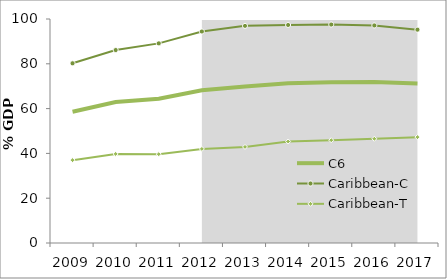
| Category | C6 | Caribbean-C | Caribbean-T |
|---|---|---|---|
| 2009.0 | 58.61 | 80.234 | 36.986 |
| 2010.0 | 62.946 | 86.131 | 39.76 |
| 2011.0 | 64.39 | 89.12 | 39.661 |
| 2012.0 | 68.204 | 94.409 | 41.999 |
| 2013.0 | 69.914 | 96.932 | 42.897 |
| 2014.0 | 71.323 | 97.33 | 45.316 |
| 2015.0 | 71.714 | 97.53 | 45.897 |
| 2016.0 | 71.826 | 97.12 | 46.533 |
| 2017.0 | 71.246 | 95.229 | 47.263 |